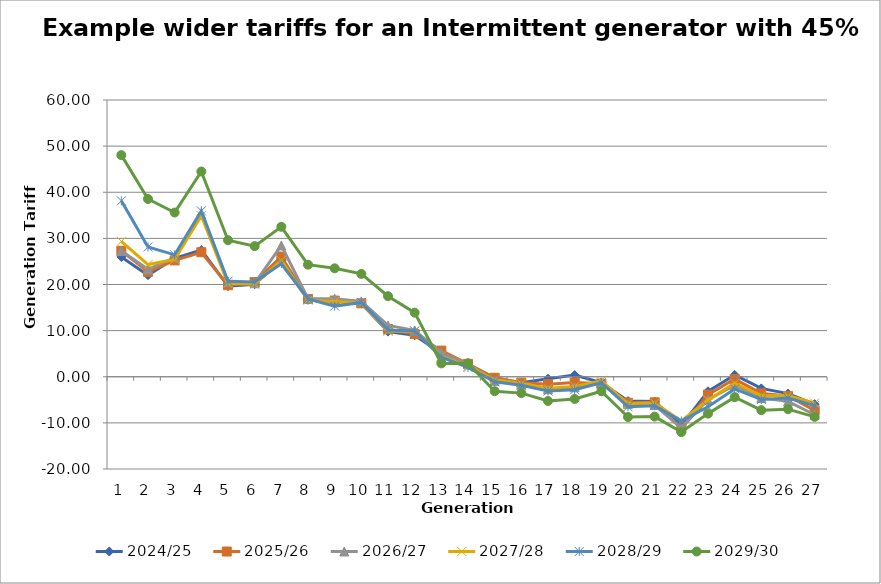
| Category | 2024/25 | 2025/26 | 2026/27 | 2027/28 | 2028/29 | 2029/30 |
|---|---|---|---|---|---|---|
| 0 | 25.966 | 27.316 | 27.254 | 29.355 | 38.136 | 48.051 |
| 1 | 22.02 | 22.753 | 23.295 | 24.32 | 28.135 | 38.543 |
| 2 | 25.685 | 25.22 | 25.852 | 25.434 | 26.429 | 35.599 |
| 3 | 27.478 | 26.997 | 35.134 | 34.922 | 35.963 | 44.498 |
| 4 | 19.658 | 19.848 | 20.588 | 20.197 | 20.697 | 29.605 |
| 5 | 20.067 | 20.514 | 20.272 | 20.077 | 20.526 | 28.322 |
| 6 | 25.261 | 26.059 | 28.468 | 25.215 | 24.501 | 32.507 |
| 7 | 16.688 | 16.872 | 16.927 | 16.598 | 16.883 | 24.296 |
| 8 | 16.336 | 16.517 | 16.932 | 16.318 | 15.314 | 23.511 |
| 9 | 15.867 | 15.921 | 16.346 | 15.992 | 16.116 | 22.299 |
| 10 | 9.788 | 10.344 | 11.117 | 9.851 | 10.13 | 17.468 |
| 11 | 8.988 | 9.255 | 10.05 | 9.879 | 9.937 | 13.898 |
| 12 | 5.059 | 5.667 | 5.199 | 4.444 | 4.235 | 2.893 |
| 13 | 2.59 | 2.798 | 2.748 | 2.295 | 2.017 | 2.932 |
| 14 | -0.27 | -0.216 | -0.875 | -0.671 | -1.071 | -3.127 |
| 15 | -1.318 | -1.276 | -1.686 | -1.425 | -1.842 | -3.55 |
| 16 | -0.42 | -1.621 | -2.705 | -2.496 | -3.105 | -5.249 |
| 17 | 0.364 | -1.239 | -2.28 | -2.086 | -2.83 | -4.81 |
| 18 | -1.253 | -1.529 | -1.22 | -0.894 | -1.3 | -3.143 |
| 19 | -5.268 | -5.642 | -5.873 | -5.822 | -6.498 | -8.737 |
| 20 | -5.366 | -5.54 | -6.123 | -5.71 | -6.283 | -8.643 |
| 21 | -10.566 | -11.197 | -11.084 | -9.589 | -9.592 | -11.999 |
| 22 | -3.154 | -3.876 | -4.977 | -5.061 | -6.51 | -7.992 |
| 23 | 0.395 | -0.502 | -1.842 | -1.396 | -2.639 | -4.416 |
| 24 | -2.521 | -3.608 | -4.604 | -4.138 | -4.945 | -7.242 |
| 25 | -3.653 | -4.179 | -5.341 | -4.077 | -4.6 | -7.03 |
| 26 | -5.93 | -7.284 | -8.245 | -5.712 | -6.252 | -8.698 |